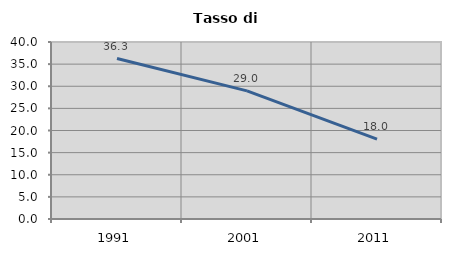
| Category | Tasso di disoccupazione   |
|---|---|
| 1991.0 | 36.262 |
| 2001.0 | 28.957 |
| 2011.0 | 18.045 |